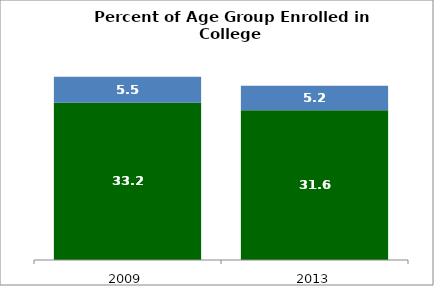
| Category | 18 to 24 | 25 to 49 |
|---|---|---|
| 2009.0 | 33.198 | 5.524 |
| 2013.0 | 31.643 | 5.16 |